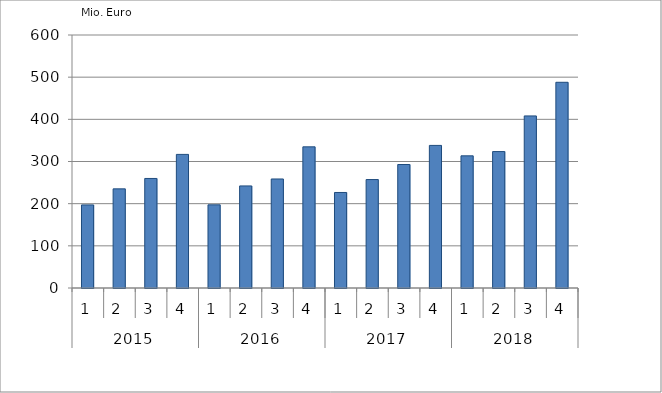
| Category | Ausbaugewerblicher Umsatz3 |
|---|---|
| 0 | 197030.42 |
| 1 | 235094.994 |
| 2 | 259758.438 |
| 3 | 316833.232 |
| 4 | 197219.532 |
| 5 | 242069.899 |
| 6 | 258547.84 |
| 7 | 334764.305 |
| 8 | 226552.317 |
| 9 | 257191.13 |
| 10 | 292853.372 |
| 11 | 338154.691 |
| 12 | 313433.569 |
| 13 | 323547.694 |
| 14 | 408057.42 |
| 15 | 487843.765 |